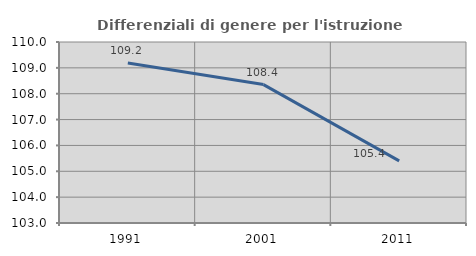
| Category | Differenziali di genere per l'istruzione superiore |
|---|---|
| 1991.0 | 109.187 |
| 2001.0 | 108.353 |
| 2011.0 | 105.401 |